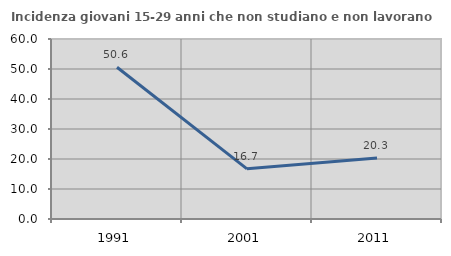
| Category | Incidenza giovani 15-29 anni che non studiano e non lavorano  |
|---|---|
| 1991.0 | 50.568 |
| 2001.0 | 16.716 |
| 2011.0 | 20.308 |